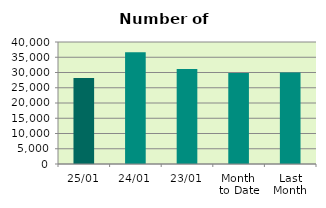
| Category | Series 0 |
|---|---|
| 25/01 | 28218 |
| 24/01 | 36646 |
| 23/01 | 31164 |
| Month 
to Date | 29832.444 |
| Last
Month | 29998.632 |